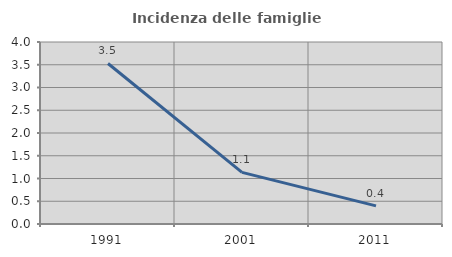
| Category | Incidenza delle famiglie numerose |
|---|---|
| 1991.0 | 3.528 |
| 2001.0 | 1.135 |
| 2011.0 | 0.399 |